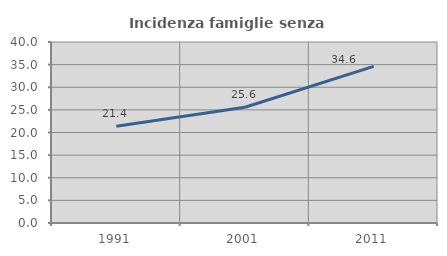
| Category | Incidenza famiglie senza nuclei |
|---|---|
| 1991.0 | 21.393 |
| 2001.0 | 25.576 |
| 2011.0 | 34.607 |